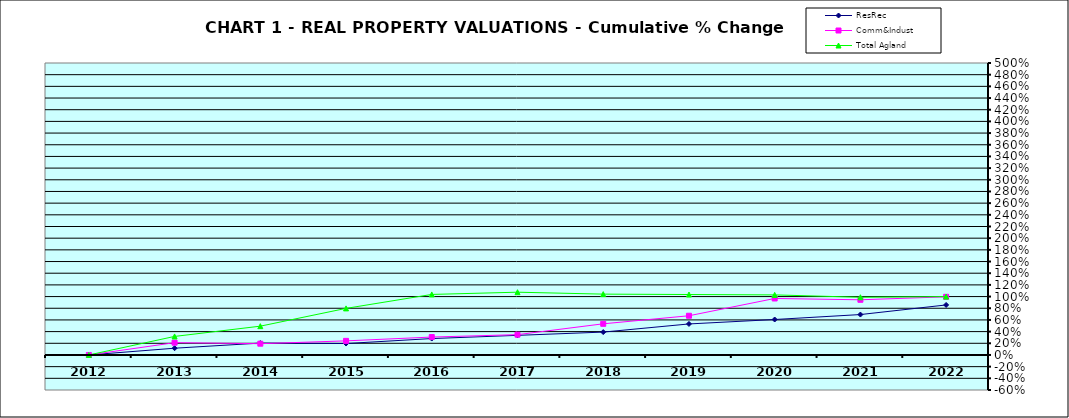
| Category | ResRec | Comm&Indust | Total Agland |
|---|---|---|---|
| 2012.0 | 0 | 0 | 0 |
| 2013.0 | 0.116 | 0.211 | 0.317 |
| 2014.0 | 0.204 | 0.193 | 0.493 |
| 2015.0 | 0.196 | 0.241 | 0.798 |
| 2016.0 | 0.281 | 0.307 | 1.037 |
| 2017.0 | 0.336 | 0.348 | 1.075 |
| 2018.0 | 0.392 | 0.534 | 1.042 |
| 2019.0 | 0.531 | 0.672 | 1.035 |
| 2020.0 | 0.607 | 0.967 | 1.029 |
| 2021.0 | 0.692 | 0.945 | 0.988 |
| 2022.0 | 0.856 | 0.996 | 0.999 |